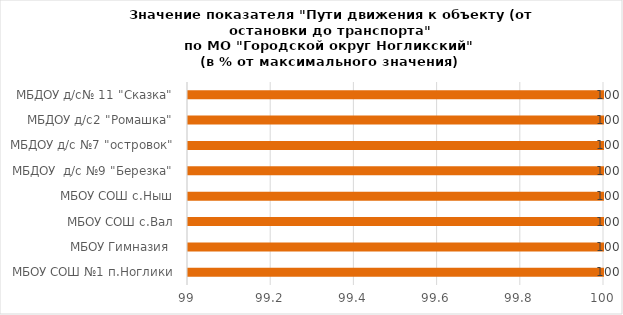
| Category | Series 0 |
|---|---|
| МБОУ СОШ №1 п.Ноглики | 100 |
| МБОУ Гимназия  | 100 |
| МБОУ СОШ с.Вал | 100 |
| МБОУ СОШ с.Ныш | 100 |
| МБДОУ  д/с №9 "Березка" | 100 |
| МБДОУ д/с №7 "островок" | 100 |
| МБДОУ д/с2 "Ромашка" | 100 |
| МБДОУ д/с№ 11 "Сказка" | 100 |